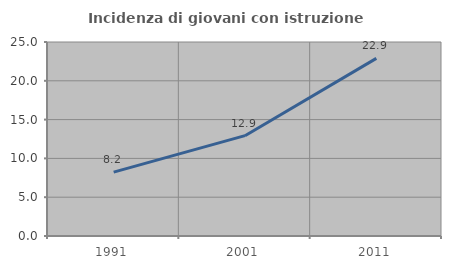
| Category | Incidenza di giovani con istruzione universitaria |
|---|---|
| 1991.0 | 8.235 |
| 2001.0 | 12.929 |
| 2011.0 | 22.89 |